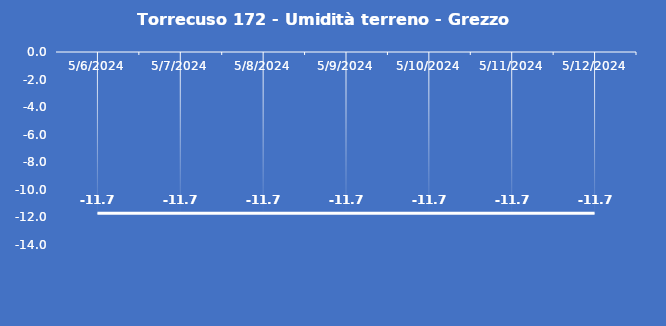
| Category | Torrecuso 172 - Umidità terreno - Grezzo (%VWC) |
|---|---|
| 5/6/24 | -11.7 |
| 5/7/24 | -11.7 |
| 5/8/24 | -11.7 |
| 5/9/24 | -11.7 |
| 5/10/24 | -11.7 |
| 5/11/24 | -11.7 |
| 5/12/24 | -11.7 |